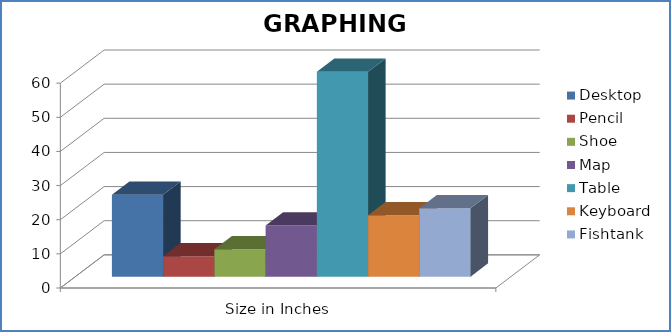
| Category | Desktop | Pencil | Shoe | Map | Table | Keyboard | Fishtank |
|---|---|---|---|---|---|---|---|
| Size in Inches | 24 | 6 | 8 | 15 | 60 | 18 | 20 |